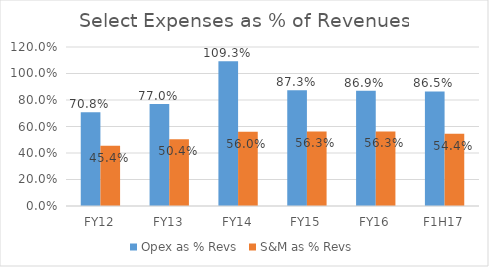
| Category | Opex as % Revs | S&M as % Revs |
|---|---|---|
| FY12 | 0.708 | 0.454 |
| FY13 | 0.77 | 0.504 |
| FY14 | 1.093 | 0.56 |
| FY15 | 0.873 | 0.563 |
| FY16 | 0.869 | 0.563 |
| F1H17 | 0.865 | 0.544 |